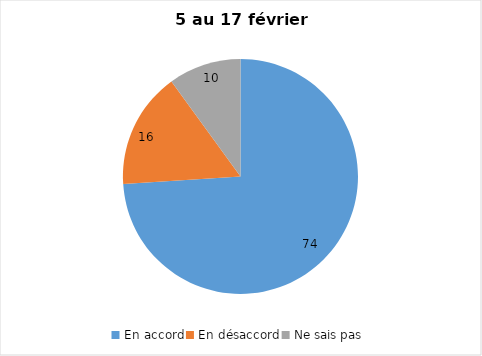
| Category | Series 0 |
|---|---|
| En accord | 74 |
| En désaccord | 16 |
| Ne sais pas | 10 |